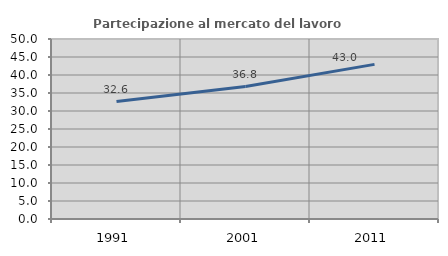
| Category | Partecipazione al mercato del lavoro  femminile |
|---|---|
| 1991.0 | 32.629 |
| 2001.0 | 36.786 |
| 2011.0 | 42.957 |